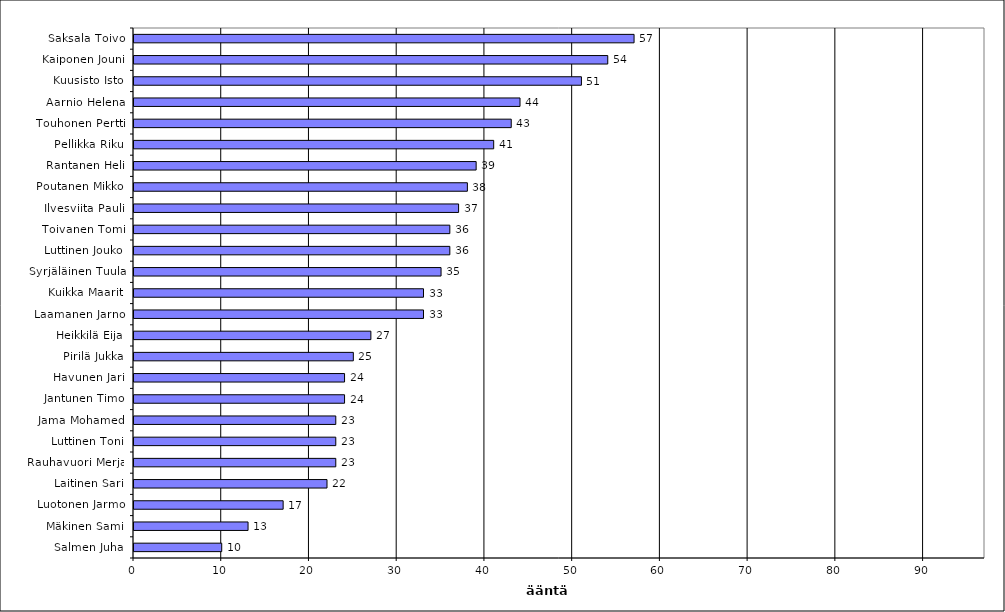
| Category | Series 0 |
|---|---|
| Saksala Toivo | 57 |
| Kaiponen Jouni | 54 |
| Kuusisto Isto | 51 |
| Aarnio Helena | 44 |
| Touhonen Pertti | 43 |
| Pellikka Riku | 41 |
| Rantanen Heli | 39 |
| Poutanen Mikko | 38 |
| Ilvesviita Pauli | 37 |
| Toivanen Tomi | 36 |
| Luttinen Jouko | 36 |
| Syrjäläinen Tuula | 35 |
| Kuikka Maarit | 33 |
| Laamanen Jarno | 33 |
| Heikkilä Eija | 27 |
| Pirilä Jukka | 25 |
| Havunen Jari | 24 |
| Jantunen Timo | 24 |
| Jama Mohamed | 23 |
| Luttinen Toni | 23 |
| Rauhavuori Merja | 23 |
| Laitinen Sari | 22 |
| Luotonen Jarmo | 17 |
| Mäkinen Sami | 13 |
| Salmen Juha | 10 |